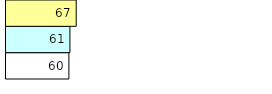
| Category | Total Standouts | Total Recd | Total Tipsters |
|---|---|---|---|
| 0 | 60 | 61 | 67 |